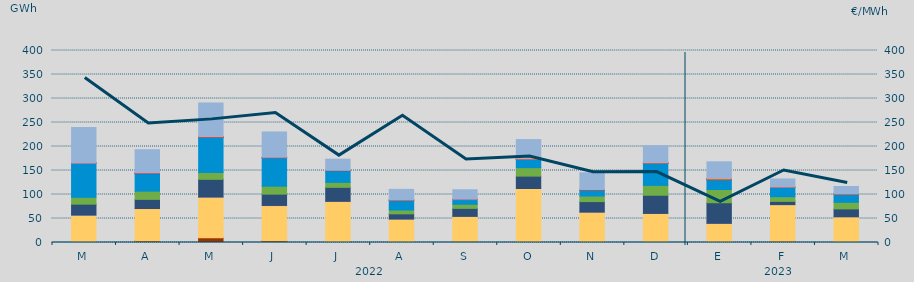
| Category | Carbón | Ciclo Combinado | Cogeneración | Consumo Bombeo | Eólica | Hidráulica | Nuclear | Otras Renovables | Solar fotovoltaica | Solar térmica | Turbinación bombeo |
|---|---|---|---|---|---|---|---|---|---|---|---|
| M | 696.5 | 56010.8 | 391.8 | 22798.3 | 14218 | 71626.6 | 0 | 7.4 | 87.7 | 6.7 | 73580.2 |
| A | 3349.534 | 67415.187 | 93.591 | 18989.102 | 17056.874 | 36445.011 | 1248.7 | 45.8 | 106.634 | 333.066 | 48166.851 |
| M | 10012.495 | 84316.131 | 342.191 | 36920.803 | 14355.123 | 73448.126 | 0.3 | 0 | 350.4 | 549.325 | 70399.534 |
| J | 3803.776 | 72994.164 | 408.816 | 23523.459 | 16484.811 | 59296.475 | 327.825 | 3.325 | 281.65 | 342.175 | 52808.788 |
| J | 2026.357 | 83630.229 | 62.5 | 29193.443 | 10247.658 | 24517.982 | 107.35 | 0 | 186.925 | 340.15 | 23284.195 |
| A | 608.425 | 48201.184 | 25.75 | 10881.743 | 7912.923 | 20661.25 | 49.5 | 8.225 | 251.425 | 88.725 | 21982.08 |
| S | 2432.475 | 52018.85 | 0.5 | 16627 | 8549.825 | 9810.3 | 0 | 23 | 777.175 | 6.75 | 19642.325 |
| O | 1876.1 | 110603.205 | 45 | 25745.4 | 17659.375 | 17006.05 | 12.825 | 16.6 | 1409.775 | 15.5 | 40055.836 |
| N | 1396.025 | 61724.955 | 198.008 | 21869.975 | 11579.495 | 12449.175 | 266.725 | 0 | 996.225 | 0 | 34713.224 |
| D | 1126.208 | 59335.684 | 104.85 | 37837.8 | 20596.98 | 45465.168 | 544.3 | 0 | 1011.875 | 1.5 | 35471.986 |
| E | 478.95 | 39423.05 | 26.617 | 42912.617 | 27499.217 | 20419.292 | 13.625 | 0 | 2540.742 | 1.5 | 34818.533 |
| F | 2850.925 | 76083.275 | 1.55 | 6739.65 | 9661.175 | 19240.1 | 0 | 0 | 962.675 | 47.25 | 16781.025 |
| M | 1195.025 | 52392.533 | 3.3 | 16393.158 | 13789.6 | 16980.517 | 40.625 | 4.5 | 911.6 | 43.15 | 14940.475 |